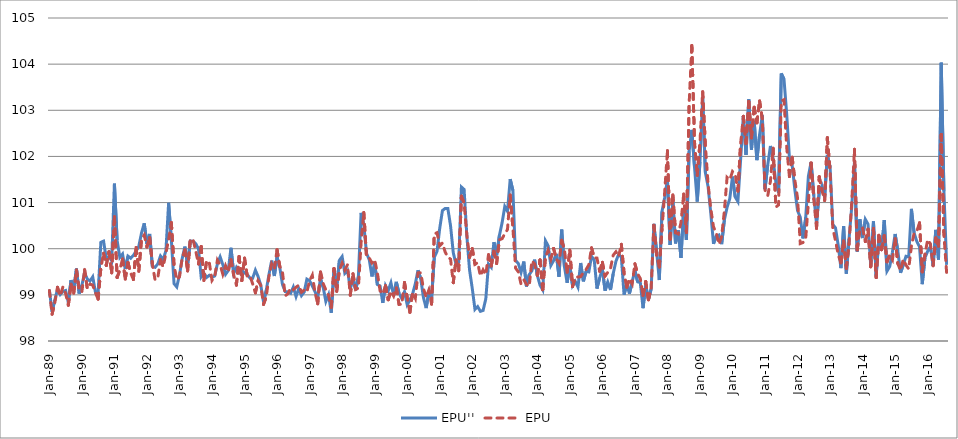
| Category | EPU'' | EPU |
|---|---|---|
| 1989-01-01 | 99.115 | 99.093 |
| 1989-02-01 | 98.632 | 98.58 |
| 1989-03-01 | 98.885 | 98.826 |
| 1989-04-01 | 99.119 | 99.162 |
| 1989-05-01 | 99.007 | 98.978 |
| 1989-06-01 | 99.075 | 99.171 |
| 1989-07-01 | 99.094 | 99.031 |
| 1989-08-01 | 98.837 | 98.777 |
| 1989-09-01 | 99.32 | 99.23 |
| 1989-10-01 | 99.119 | 99.038 |
| 1989-11-01 | 99.57 | 99.54 |
| 1989-12-01 | 99.028 | 99.109 |
| 1990-01-01 | 99.21 | 99.063 |
| 1990-02-01 | 99.48 | 99.545 |
| 1990-03-01 | 99.342 | 99.136 |
| 1990-04-01 | 99.3 | 99.234 |
| 1990-05-01 | 99.391 | 99.211 |
| 1990-06-01 | 99.058 | 99.045 |
| 1990-07-01 | 99.064 | 98.907 |
| 1990-08-01 | 100.139 | 99.579 |
| 1990-09-01 | 100.164 | 99.902 |
| 1990-10-01 | 99.787 | 99.639 |
| 1990-11-01 | 99.834 | 99.932 |
| 1990-12-01 | 99.739 | 99.475 |
| 1991-01-01 | 101.41 | 100.694 |
| 1991-02-01 | 100.18 | 99.376 |
| 1991-03-01 | 99.813 | 99.542 |
| 1991-04-01 | 99.886 | 99.778 |
| 1991-05-01 | 99.561 | 99.341 |
| 1991-06-01 | 99.839 | 99.7 |
| 1991-07-01 | 99.794 | 99.474 |
| 1991-08-01 | 99.855 | 99.332 |
| 1991-09-01 | 99.949 | 100.025 |
| 1991-10-01 | 100.053 | 99.511 |
| 1991-11-01 | 100.342 | 100.208 |
| 1991-12-01 | 100.551 | 100.297 |
| 1992-01-01 | 100.104 | 100.037 |
| 1992-02-01 | 100.319 | 100.24 |
| 1992-03-01 | 99.62 | 99.666 |
| 1992-04-01 | 99.597 | 99.323 |
| 1992-05-01 | 99.67 | 99.368 |
| 1992-06-01 | 99.842 | 99.759 |
| 1992-07-01 | 99.764 | 99.607 |
| 1992-08-01 | 99.96 | 99.908 |
| 1992-09-01 | 100.996 | 100.197 |
| 1992-10-01 | 100.19 | 100.567 |
| 1992-11-01 | 99.243 | 99.64 |
| 1992-12-01 | 99.172 | 99.326 |
| 1993-01-01 | 99.43 | 99.39 |
| 1993-02-01 | 99.786 | 99.802 |
| 1993-03-01 | 100.046 | 99.973 |
| 1993-04-01 | 99.647 | 99.518 |
| 1993-05-01 | 100.166 | 100.205 |
| 1993-06-01 | 100.163 | 100.201 |
| 1993-07-01 | 100.109 | 99.951 |
| 1993-08-01 | 100 | 99.668 |
| 1993-09-01 | 99.389 | 100.046 |
| 1993-10-01 | 99.472 | 99.311 |
| 1993-11-01 | 99.377 | 99.742 |
| 1993-12-01 | 99.424 | 99.7 |
| 1994-01-01 | 99.382 | 99.313 |
| 1994-02-01 | 99.409 | 99.396 |
| 1994-03-01 | 99.675 | 99.751 |
| 1994-04-01 | 99.823 | 99.652 |
| 1994-05-01 | 99.652 | 99.447 |
| 1994-06-01 | 99.444 | 99.632 |
| 1994-07-01 | 99.529 | 99.496 |
| 1994-08-01 | 100.02 | 99.763 |
| 1994-09-01 | 99.467 | 99.429 |
| 1994-10-01 | 99.593 | 99.211 |
| 1994-11-01 | 99.479 | 99.83 |
| 1994-12-01 | 99.532 | 99.309 |
| 1995-01-01 | 99.474 | 99.797 |
| 1995-02-01 | 99.444 | 99.405 |
| 1995-03-01 | 99.364 | 99.417 |
| 1995-04-01 | 99.36 | 99.237 |
| 1995-05-01 | 99.536 | 99.044 |
| 1995-06-01 | 99.398 | 99.306 |
| 1995-07-01 | 99.208 | 99.207 |
| 1995-08-01 | 98.848 | 98.793 |
| 1995-09-01 | 99.096 | 98.954 |
| 1995-10-01 | 99.435 | 99.396 |
| 1995-11-01 | 99.741 | 99.67 |
| 1995-12-01 | 99.409 | 99.563 |
| 1996-01-01 | 99.816 | 99.98 |
| 1996-02-01 | 99.595 | 99.62 |
| 1996-03-01 | 99.223 | 99.487 |
| 1996-04-01 | 99.07 | 98.98 |
| 1996-05-01 | 99.064 | 99.023 |
| 1996-06-01 | 99.034 | 99.15 |
| 1996-07-01 | 99.169 | 99.111 |
| 1996-08-01 | 98.964 | 99.165 |
| 1996-09-01 | 99.137 | 99.211 |
| 1996-10-01 | 98.983 | 99.057 |
| 1996-11-01 | 99.061 | 99.103 |
| 1996-12-01 | 99.34 | 99.06 |
| 1997-01-01 | 99.306 | 99.31 |
| 1997-02-01 | 99.194 | 99.428 |
| 1997-03-01 | 99.069 | 99.055 |
| 1997-04-01 | 98.934 | 98.804 |
| 1997-05-01 | 99.355 | 99.497 |
| 1997-06-01 | 99.167 | 99.247 |
| 1997-07-01 | 98.856 | 99.107 |
| 1997-08-01 | 99.003 | 98.99 |
| 1997-09-01 | 98.612 | 98.73 |
| 1997-10-01 | 99.531 | 99.57 |
| 1997-11-01 | 99.161 | 99.075 |
| 1997-12-01 | 99.75 | 99.534 |
| 1998-01-01 | 99.83 | 99.687 |
| 1998-02-01 | 99.466 | 99.538 |
| 1998-03-01 | 99.529 | 99.654 |
| 1998-04-01 | 99.136 | 98.993 |
| 1998-05-01 | 99.369 | 99.458 |
| 1998-06-01 | 99.103 | 99.118 |
| 1998-07-01 | 99.398 | 99.148 |
| 1998-08-01 | 100.776 | 100.137 |
| 1998-09-01 | 100.508 | 100.785 |
| 1998-10-01 | 99.902 | 99.824 |
| 1998-11-01 | 99.764 | 99.799 |
| 1998-12-01 | 99.399 | 99.691 |
| 1999-01-01 | 99.683 | 99.763 |
| 1999-02-01 | 99.225 | 99.476 |
| 1999-03-01 | 99.192 | 99.088 |
| 1999-04-01 | 98.825 | 99.017 |
| 1999-05-01 | 99.203 | 99.197 |
| 1999-06-01 | 99.087 | 98.895 |
| 1999-07-01 | 99.262 | 99.079 |
| 1999-08-01 | 98.991 | 98.974 |
| 1999-09-01 | 99.281 | 99.151 |
| 1999-10-01 | 99.031 | 98.794 |
| 1999-11-01 | 98.922 | 98.795 |
| 1999-12-01 | 99.069 | 99.267 |
| 2000-01-01 | 98.786 | 98.953 |
| 2000-02-01 | 98.887 | 98.62 |
| 2000-03-01 | 99.021 | 99.048 |
| 2000-04-01 | 99.242 | 98.925 |
| 2000-05-01 | 99.533 | 99.476 |
| 2000-06-01 | 99.35 | 99.478 |
| 2000-07-01 | 98.941 | 99.137 |
| 2000-08-01 | 98.713 | 98.949 |
| 2000-09-01 | 99.067 | 99.1 |
| 2000-10-01 | 98.923 | 98.799 |
| 2000-11-01 | 99.813 | 100.32 |
| 2000-12-01 | 99.942 | 100.348 |
| 2001-01-01 | 100.441 | 100.064 |
| 2001-02-01 | 100.827 | 100.123 |
| 2001-03-01 | 100.873 | 99.93 |
| 2001-04-01 | 100.87 | 99.82 |
| 2001-05-01 | 100.495 | 99.773 |
| 2001-06-01 | 99.913 | 99.263 |
| 2001-07-01 | 99.667 | 99.757 |
| 2001-08-01 | 99.708 | 99.522 |
| 2001-09-01 | 101.337 | 101.138 |
| 2001-10-01 | 101.285 | 100.987 |
| 2001-11-01 | 100.282 | 100.303 |
| 2001-12-01 | 99.542 | 99.812 |
| 2002-01-01 | 99.142 | 100.006 |
| 2002-02-01 | 98.685 | 99.662 |
| 2002-03-01 | 98.745 | 99.698 |
| 2002-04-01 | 98.643 | 99.411 |
| 2002-05-01 | 98.663 | 99.542 |
| 2002-06-01 | 98.914 | 99.44 |
| 2002-07-01 | 99.669 | 99.869 |
| 2002-08-01 | 99.598 | 99.626 |
| 2002-09-01 | 100.142 | 99.945 |
| 2002-10-01 | 99.857 | 99.683 |
| 2002-11-01 | 100.28 | 100.194 |
| 2002-12-01 | 100.559 | 100.217 |
| 2003-01-01 | 100.915 | 100.323 |
| 2003-02-01 | 100.81 | 100.416 |
| 2003-03-01 | 101.507 | 101.164 |
| 2003-04-01 | 101.263 | 100.446 |
| 2003-05-01 | 99.744 | 99.578 |
| 2003-06-01 | 99.677 | 99.497 |
| 2003-07-01 | 99.488 | 99.233 |
| 2003-08-01 | 99.723 | 99.33 |
| 2003-09-01 | 99.181 | 99.228 |
| 2003-10-01 | 99.436 | 99.186 |
| 2003-11-01 | 99.521 | 99.738 |
| 2003-12-01 | 99.763 | 99.672 |
| 2004-01-01 | 99.427 | 99.422 |
| 2004-02-01 | 99.211 | 99.757 |
| 2004-03-01 | 99.108 | 99.112 |
| 2004-04-01 | 100.173 | 99.814 |
| 2004-05-01 | 100.064 | 99.967 |
| 2004-06-01 | 99.637 | 99.778 |
| 2004-07-01 | 99.741 | 100.007 |
| 2004-08-01 | 99.888 | 99.783 |
| 2004-09-01 | 99.393 | 99.683 |
| 2004-10-01 | 100.414 | 100.182 |
| 2004-11-01 | 99.613 | 99.984 |
| 2004-12-01 | 99.26 | 99.49 |
| 2005-01-01 | 99.636 | 99.97 |
| 2005-02-01 | 99.197 | 99.179 |
| 2005-03-01 | 99.292 | 99.378 |
| 2005-04-01 | 99.166 | 99.387 |
| 2005-05-01 | 99.69 | 99.395 |
| 2005-06-01 | 99.293 | 99.482 |
| 2005-07-01 | 99.509 | 99.549 |
| 2005-08-01 | 99.497 | 99.65 |
| 2005-09-01 | 99.835 | 100.021 |
| 2005-10-01 | 99.753 | 99.803 |
| 2005-11-01 | 99.136 | 99.797 |
| 2005-12-01 | 99.367 | 99.513 |
| 2006-01-01 | 99.561 | 99.705 |
| 2006-02-01 | 99.091 | 99.408 |
| 2006-03-01 | 99.276 | 99.486 |
| 2006-04-01 | 99.107 | 99.571 |
| 2006-05-01 | 99.462 | 99.859 |
| 2006-06-01 | 99.725 | 99.934 |
| 2006-07-01 | 99.879 | 99.833 |
| 2006-08-01 | 99.818 | 100.096 |
| 2006-09-01 | 99.004 | 99.475 |
| 2006-10-01 | 99.219 | 99.164 |
| 2006-11-01 | 99.027 | 99.352 |
| 2006-12-01 | 99.288 | 99.238 |
| 2007-01-01 | 99.528 | 99.674 |
| 2007-02-01 | 99.282 | 99.457 |
| 2007-03-01 | 99.265 | 99.354 |
| 2007-04-01 | 98.711 | 98.988 |
| 2007-05-01 | 99.207 | 99.289 |
| 2007-06-01 | 98.902 | 98.892 |
| 2007-07-01 | 99.128 | 99.137 |
| 2007-08-01 | 100.539 | 100.507 |
| 2007-09-01 | 99.942 | 99.865 |
| 2007-10-01 | 99.322 | 99.605 |
| 2007-11-01 | 100.806 | 100.427 |
| 2007-12-01 | 101.115 | 101.237 |
| 2008-01-01 | 101.497 | 102.125 |
| 2008-02-01 | 100.08 | 100.207 |
| 2008-03-01 | 101.015 | 101.166 |
| 2008-04-01 | 100.115 | 100.347 |
| 2008-05-01 | 100.403 | 100.32 |
| 2008-06-01 | 99.801 | 100.566 |
| 2008-07-01 | 100.877 | 101.185 |
| 2008-08-01 | 100.19 | 100.354 |
| 2008-09-01 | 102.112 | 103.131 |
| 2008-10-01 | 102.573 | 104.405 |
| 2008-11-01 | 101.762 | 102.314 |
| 2008-12-01 | 101.023 | 101.588 |
| 2009-01-01 | 101.88 | 102.303 |
| 2009-02-01 | 103.262 | 103.403 |
| 2009-03-01 | 101.652 | 102.24 |
| 2009-04-01 | 101.346 | 101.399 |
| 2009-05-01 | 100.764 | 100.865 |
| 2009-06-01 | 100.106 | 100.473 |
| 2009-07-01 | 100.275 | 100.345 |
| 2009-08-01 | 100.298 | 100.096 |
| 2009-09-01 | 100.099 | 100.267 |
| 2009-10-01 | 100.622 | 100.814 |
| 2009-11-01 | 100.896 | 101.547 |
| 2009-12-01 | 101.083 | 101.495 |
| 2010-01-01 | 101.561 | 101.673 |
| 2010-02-01 | 101.123 | 101.614 |
| 2010-03-01 | 101.023 | 101.25 |
| 2010-04-01 | 101.931 | 102.273 |
| 2010-05-01 | 102.876 | 102.87 |
| 2010-06-01 | 102.033 | 102.28 |
| 2010-07-01 | 103.237 | 103.189 |
| 2010-08-01 | 102.146 | 102.403 |
| 2010-09-01 | 102.772 | 103.068 |
| 2010-10-01 | 101.92 | 102.729 |
| 2010-11-01 | 102.474 | 103.203 |
| 2010-12-01 | 102.893 | 102.814 |
| 2011-01-01 | 101.289 | 101.271 |
| 2011-02-01 | 101.813 | 101.149 |
| 2011-03-01 | 102.228 | 101.462 |
| 2011-04-01 | 101.93 | 102.178 |
| 2011-05-01 | 101.439 | 100.902 |
| 2011-06-01 | 101.209 | 100.951 |
| 2011-07-01 | 103.798 | 103.202 |
| 2011-08-01 | 103.675 | 103.231 |
| 2011-09-01 | 102.919 | 102.196 |
| 2011-10-01 | 101.97 | 101.563 |
| 2011-11-01 | 101.816 | 101.984 |
| 2011-12-01 | 101.28 | 101.488 |
| 2012-01-01 | 100.824 | 101.097 |
| 2012-02-01 | 100.683 | 100.112 |
| 2012-03-01 | 100.223 | 100.134 |
| 2012-04-01 | 100.666 | 100.216 |
| 2012-05-01 | 101.571 | 101.005 |
| 2012-06-01 | 101.879 | 101.858 |
| 2012-07-01 | 101.148 | 101.078 |
| 2012-08-01 | 100.541 | 100.442 |
| 2012-09-01 | 101.228 | 101.558 |
| 2012-10-01 | 101.36 | 101.267 |
| 2012-11-01 | 101.111 | 101.046 |
| 2012-12-01 | 102.034 | 102.404 |
| 2013-01-01 | 101.773 | 101.688 |
| 2013-02-01 | 100.523 | 100.448 |
| 2013-03-01 | 100.452 | 100.173 |
| 2013-04-01 | 100.077 | 99.871 |
| 2013-05-01 | 99.579 | 99.694 |
| 2013-06-01 | 100.49 | 100.169 |
| 2013-07-01 | 99.462 | 99.574 |
| 2013-08-01 | 100.215 | 100.111 |
| 2013-09-01 | 100.913 | 101.017 |
| 2013-10-01 | 101.884 | 102.156 |
| 2013-11-01 | 99.938 | 99.975 |
| 2013-12-01 | 100.635 | 100.434 |
| 2014-01-01 | 100.231 | 100.445 |
| 2014-02-01 | 100.637 | 100.154 |
| 2014-03-01 | 100.534 | 100.423 |
| 2014-04-01 | 99.634 | 99.609 |
| 2014-05-01 | 100.591 | 100.439 |
| 2014-06-01 | 99.414 | 99.373 |
| 2014-07-01 | 100.221 | 100.292 |
| 2014-08-01 | 99.979 | 99.978 |
| 2014-09-01 | 100.622 | 100.282 |
| 2014-10-01 | 99.513 | 99.717 |
| 2014-11-01 | 99.616 | 99.863 |
| 2014-12-01 | 99.925 | 99.762 |
| 2015-01-01 | 100.319 | 100.216 |
| 2015-02-01 | 99.951 | 99.674 |
| 2015-03-01 | 99.478 | 99.528 |
| 2015-04-01 | 99.651 | 99.769 |
| 2015-05-01 | 99.835 | 99.646 |
| 2015-06-01 | 99.821 | 99.563 |
| 2015-07-01 | 100.864 | 100.055 |
| 2015-08-01 | 100.342 | 100.337 |
| 2015-09-01 | 100.156 | 100.379 |
| 2015-10-01 | 100.041 | 100.562 |
| 2015-11-01 | 99.232 | 99.5 |
| 2015-12-01 | 99.802 | 99.875 |
| 2016-01-01 | 99.947 | 100.197 |
| 2016-02-01 | 100.044 | 100.103 |
| 2016-03-01 | 99.63 | 99.63 |
| 2016-04-01 | 100.408 | 100.233 |
| 2016-05-01 | 99.765 | 100.054 |
| 2016-06-01 | 104.032 | 102.474 |
| 2016-07-01 | 101.246 | 100.3 |
| 2016-08-01 | 99.65 | 99.477 |